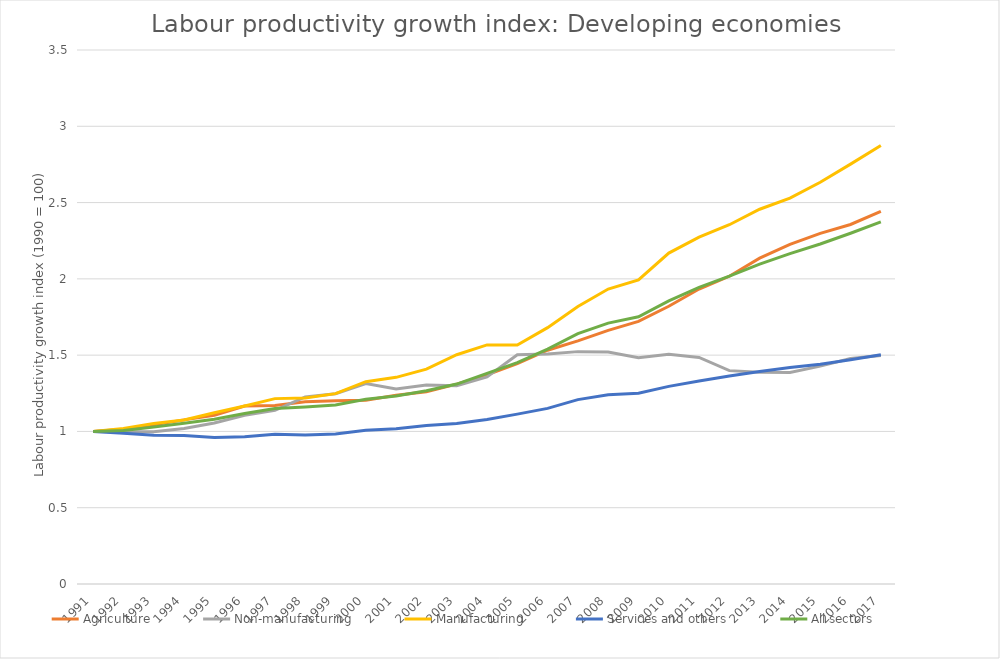
| Category | Agriculture | Non-manufacturing | Manufacturing | Services and others | All sectors |
|---|---|---|---|---|---|
| 1991.0 | 1 | 1 | 1 | 1 | 1 |
| 1992.0 | 1.014 | 0.997 | 1.019 | 0.988 | 1.006 |
| 1993.0 | 1.043 | 0.998 | 1.052 | 0.976 | 1.028 |
| 1994.0 | 1.076 | 1.02 | 1.075 | 0.973 | 1.054 |
| 1995.0 | 1.106 | 1.055 | 1.123 | 0.961 | 1.079 |
| 1996.0 | 1.167 | 1.105 | 1.167 | 0.964 | 1.117 |
| 1997.0 | 1.169 | 1.138 | 1.215 | 0.981 | 1.15 |
| 1998.0 | 1.194 | 1.226 | 1.22 | 0.977 | 1.161 |
| 1999.0 | 1.202 | 1.248 | 1.248 | 0.983 | 1.173 |
| 2000.0 | 1.205 | 1.313 | 1.326 | 1.008 | 1.21 |
| 2001.0 | 1.237 | 1.278 | 1.355 | 1.017 | 1.232 |
| 2002.0 | 1.26 | 1.304 | 1.408 | 1.039 | 1.267 |
| 2003.0 | 1.31 | 1.3 | 1.503 | 1.052 | 1.31 |
| 2004.0 | 1.371 | 1.358 | 1.567 | 1.078 | 1.38 |
| 2005.0 | 1.444 | 1.503 | 1.566 | 1.113 | 1.451 |
| 2006.0 | 1.532 | 1.508 | 1.68 | 1.151 | 1.539 |
| 2007.0 | 1.594 | 1.523 | 1.819 | 1.208 | 1.641 |
| 2008.0 | 1.662 | 1.52 | 1.933 | 1.24 | 1.71 |
| 2009.0 | 1.721 | 1.483 | 1.993 | 1.251 | 1.751 |
| 2010.0 | 1.82 | 1.507 | 2.169 | 1.295 | 1.855 |
| 2011.0 | 1.933 | 1.485 | 2.273 | 1.33 | 1.944 |
| 2012.0 | 2.017 | 1.398 | 2.355 | 1.363 | 2.017 |
| 2013.0 | 2.135 | 1.389 | 2.456 | 1.392 | 2.096 |
| 2014.0 | 2.226 | 1.387 | 2.529 | 1.418 | 2.165 |
| 2015.0 | 2.298 | 1.428 | 2.633 | 1.441 | 2.229 |
| 2016.0 | 2.356 | 1.477 | 2.752 | 1.47 | 2.299 |
| 2017.0 | 2.442 | 1.498 | 2.875 | 1.502 | 2.373 |